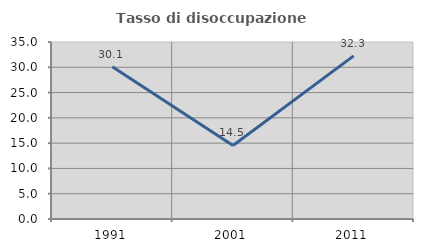
| Category | Tasso di disoccupazione giovanile  |
|---|---|
| 1991.0 | 30.12 |
| 2001.0 | 14.545 |
| 2011.0 | 32.258 |